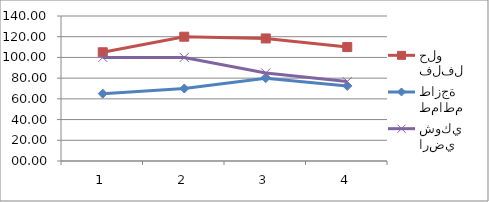
| Category | فلفل حلو | طماطم طازجة | ارضي شوكي |
|---|---|---|---|
| 0 | 105 | 65 | 100 |
| 1 | 120 | 70 | 100 |
| 2 | 118.33 | 80 | 85 |
| 3 | 110 | 72.5 | 76.67 |